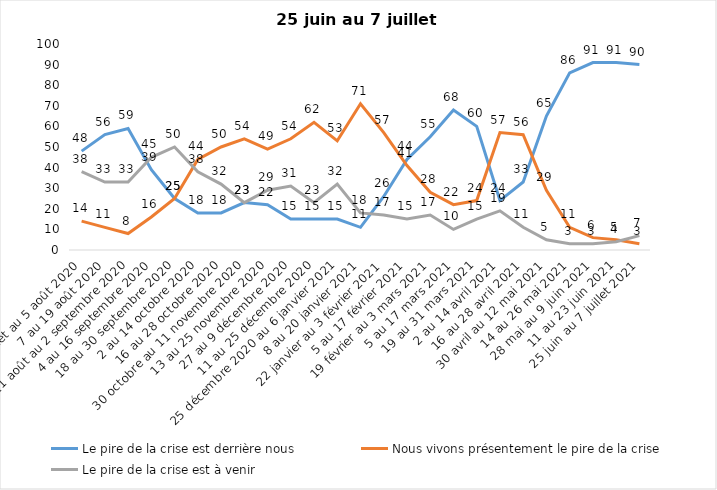
| Category | Le pire de la crise est derrière nous | Nous vivons présentement le pire de la crise | Le pire de la crise est à venir |
|---|---|---|---|
| 24 juillet au 5 août 2020 | 48 | 14 | 38 |
| 7 au 19 août 2020 | 56 | 11 | 33 |
| 21 août au 2 septembre 2020 | 59 | 8 | 33 |
| 4 au 16 septembre 2020 | 39 | 16 | 45 |
| 18 au 30 septembre 2020 | 25 | 25 | 50 |
| 2 au 14 octobre 2020 | 18 | 44 | 38 |
| 16 au 28 octobre 2020 | 18 | 50 | 32 |
| 30 octobre au 11 novembre 2020 | 23 | 54 | 23 |
| 13 au 25 novembre 2020 | 22 | 49 | 29 |
| 27 au 9 décembre 2020 | 15 | 54 | 31 |
| 11 au 25 décembre 2020 | 15 | 62 | 23 |
| 25 décembre 2020 au 6 janvier 2021 | 15 | 53 | 32 |
| 8 au 20 janvier 2021 | 11 | 71 | 18 |
| 22 janvier au 3 février 2021 | 26 | 57 | 17 |
| 5 au 17 février 2021 | 44 | 41 | 15 |
| 19 février au 3 mars 2021 | 55 | 28 | 17 |
| 5 au 17 mars 2021 | 68 | 22 | 10 |
| 19 au 31 mars 2021 | 60 | 24 | 15 |
| 2 au 14 avril 2021 | 24 | 57 | 19 |
| 16 au 28 avril 2021 | 33 | 56 | 11 |
| 30 avril au 12 mai 2021 | 65 | 29 | 5 |
| 14 au 26 mai 2021 | 86 | 11 | 3 |
| 28 mai au 9 juin 2021 | 91 | 6 | 3 |
| 11 au 23 juin 2021 | 91 | 5 | 4 |
| 25 juin au 7 juillet 2021 | 90 | 3 | 7 |